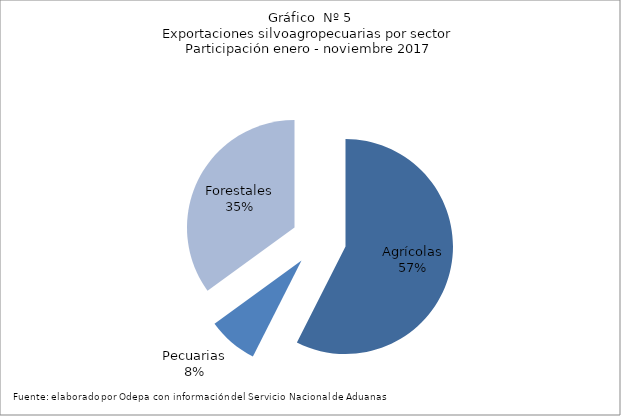
| Category | Series 0 |
|---|---|
| Agrícolas | 8300286 |
| Pecuarias | 1088954 |
| Forestales | 5054258 |